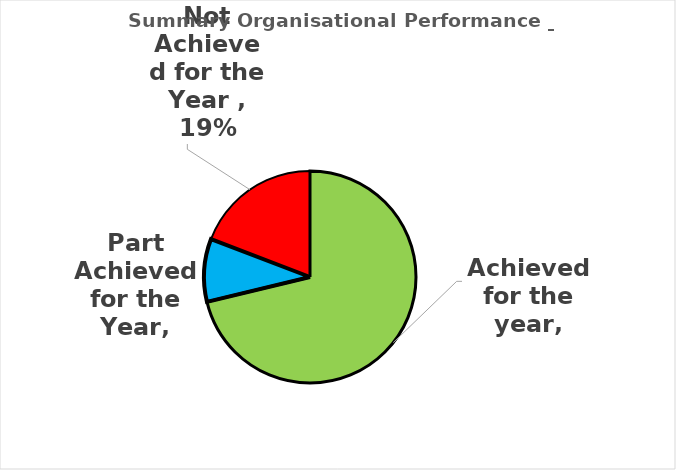
| Category | Series 0 | Series 1 |
|---|---|---|
| Achieved for the year | 0.712 |  |
| Part Achieved for the Year | 0.096 |  |
| Not Achieved for the Year  | 0.192 |  |